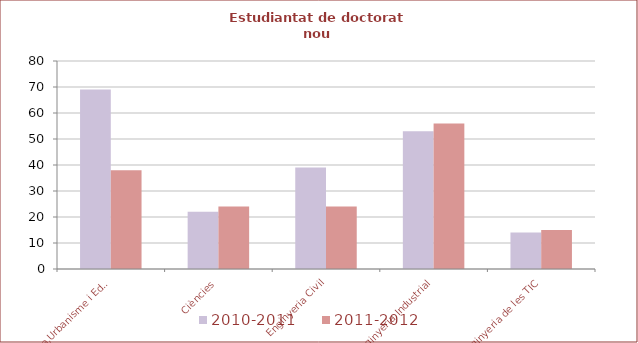
| Category | 2010-2011 | 2011-2012 |
|---|---|---|
| Arquitectura,Urbanisme i Edificació | 69 | 38 |
| Ciències | 22 | 24 |
| Enginyeria Civil | 39 | 24 |
| Enginyeria Industrial | 53 | 56 |
| Enginyeria de les TIC | 14 | 15 |